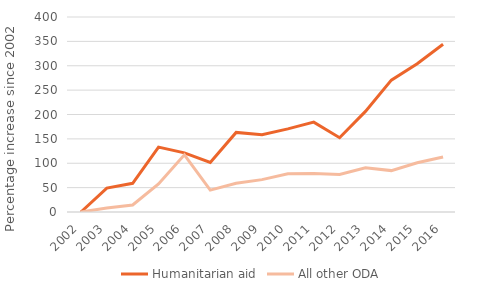
| Category | Humanitarian aid | All other ODA |
|---|---|---|
| 2002.0 | 0 | 0 |
| 2003.0 | 49.151 | 8.118 |
| 2004.0 | 58.839 | 14.311 |
| 2005.0 | 133.086 | 57.46 |
| 2006.0 | 121.278 | 117.31 |
| 2007.0 | 101.567 | 44.94 |
| 2008.0 | 163.273 | 58.983 |
| 2009.0 | 158.522 | 66.423 |
| 2010.0 | 170.562 | 78.297 |
| 2011.0 | 184.307 | 79 |
| 2012.0 | 152.354 | 76.8 |
| 2013.0 | 206.4 | 90.884 |
| 2014.0 | 270.49 | 84.922 |
| 2015.0 | 304.177 | 101.072 |
| 2016.0 | 344.029 | 112.984 |